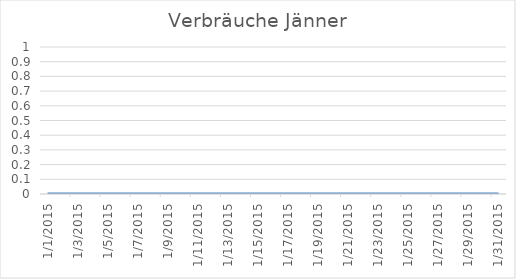
| Category | Series 0 |
|---|---|
| 01/01/2015 | 0 |
| 02/01/2015 | 0 |
| 03/01/2015 | 0 |
| 04/01/2015 | 0 |
| 05/01/2015 | 0 |
| 06/01/2015 | 0 |
| 07/01/2015 | 0 |
| 08/01/2015 | 0 |
| 09/01/2015 | 0 |
| 10/01/2015 | 0 |
| 11/01/2015 | 0 |
| 12/01/2015 | 0 |
| 13/01/2015 | 0 |
| 14/01/2015 | 0 |
| 15/01/2015 | 0 |
| 16/01/2015 | 0 |
| 17/01/2015 | 0 |
| 18/01/2015 | 0 |
| 19/01/2015 | 0 |
| 20/01/2015 | 0 |
| 21/01/2015 | 0 |
| 22/01/2015 | 0 |
| 23/01/2015 | 0 |
| 24/01/2015 | 0 |
| 25/01/2015 | 0 |
| 26/01/2015 | 0 |
| 27/01/2015 | 0 |
| 28/01/2015 | 0 |
| 29/01/2015 | 0 |
| 30/01/2015 | 0 |
| 31/01/2015 | 0 |